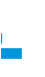
| Category | Series 0 |
|---|---|
| 0 | 0 |
| 1 | 0 |
| 2 | 0.007 |
| 3 | 0.992 |